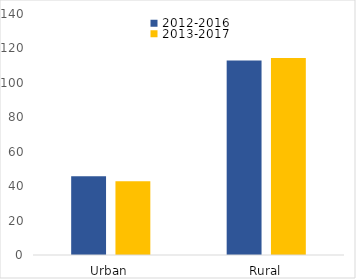
| Category | 2012-2016 | 2013-2017 |
|---|---|---|
| Urban | 45.8 | 42.8 |
| Rural | 113 | 114.4 |